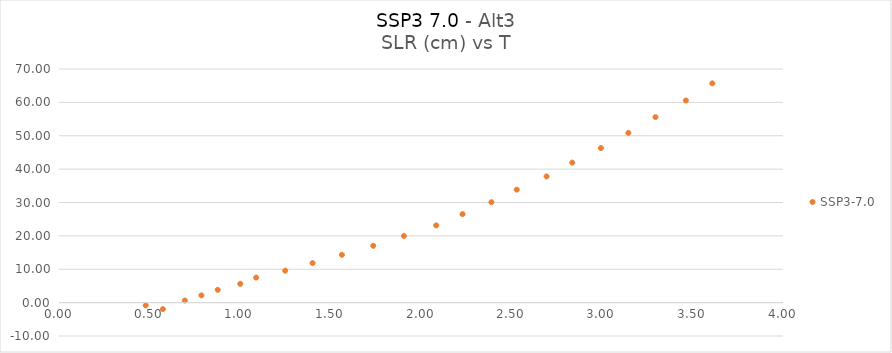
| Category | SSP3-7.0 |
|---|---|
| 0.573801925 | -1.941 |
| 0.479031654 | -0.818 |
| 0.695197934 | 0.621 |
| 0.786748548 | 2.18 |
| 0.877021499 | 3.834 |
| 1.001520332 | 5.633 |
| 1.089128948 | 7.505 |
| 1.249789297 | 9.582 |
| 1.40078434 | 11.846 |
| 1.562964909 | 14.32 |
| 1.736170354 | 17.029 |
| 1.905484817 | 19.965 |
| 2.083959789 | 23.149 |
| 2.229490262 | 26.515 |
| 2.38917286 | 30.093 |
| 2.529126517 | 33.841 |
| 2.693750826 | 37.811 |
| 2.835702675 | 41.954 |
| 2.994204726 | 46.306 |
| 3.14553335 | 50.853 |
| 3.295387887 | 55.589 |
| 3.46348676 | 60.556 |
| 3.609310907 | 65.705 |